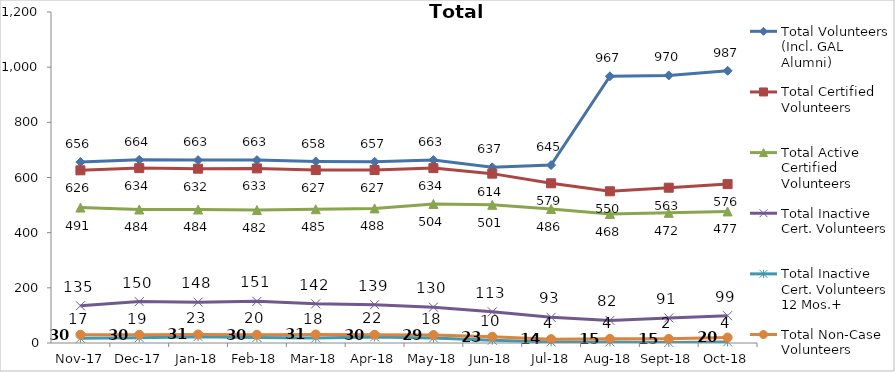
| Category | Total Volunteers (Incl. GAL Alumni) | Total Certified Volunteers | Total Active Certified Volunteers | Total Inactive Cert. Volunteers | Total Inactive Cert. Volunteers 12 Mos.+ | Total Non-Case Volunteers |
|---|---|---|---|---|---|---|
| 2017-11-01 | 656 | 626 | 491 | 135 | 17 | 30 |
| 2017-12-01 | 664 | 634 | 484 | 150 | 19 | 30 |
| 2018-01-01 | 663 | 632 | 484 | 148 | 23 | 31 |
| 2018-02-01 | 663 | 633 | 482 | 151 | 20 | 30 |
| 2018-03-01 | 658 | 627 | 485 | 142 | 18 | 31 |
| 2018-04-01 | 657 | 627 | 488 | 139 | 22 | 30 |
| 2018-05-01 | 663 | 634 | 504 | 130 | 18 | 29 |
| 2018-06-01 | 637 | 614 | 501 | 113 | 10 | 23 |
| 2018-07-01 | 645 | 579 | 486 | 93 | 4 | 14 |
| 2018-08-01 | 967 | 550 | 468 | 82 | 4 | 15 |
| 2018-09-01 | 970 | 563 | 472 | 91 | 2 | 15 |
| 2018-10-01 | 987 | 576 | 477 | 99 | 4 | 20 |